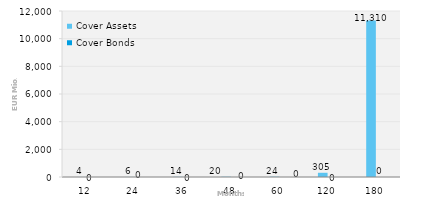
| Category | Cover Assets | Cover Bonds |
|---|---|---|
| 12.0 | 3.891 | 0 |
| 24.0 | 5.607 | 0 |
| 36.0 | 14.236 | 0 |
| 48.0 | 19.89 | 0 |
| 60.0 | 23.77 | 0 |
| 120.0 | 305.248 | 0 |
| 180.0 | 11309.554 | 0 |